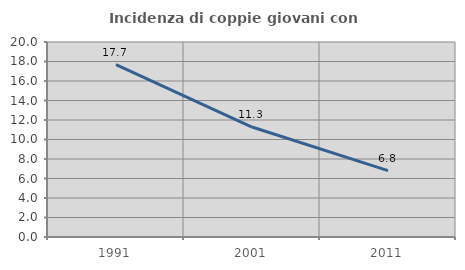
| Category | Incidenza di coppie giovani con figli |
|---|---|
| 1991.0 | 17.672 |
| 2001.0 | 11.277 |
| 2011.0 | 6.803 |